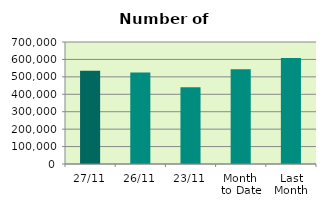
| Category | Series 0 |
|---|---|
| 27/11 | 534826 |
| 26/11 | 524368 |
| 23/11 | 440606 |
| Month 
to Date | 544195.158 |
| Last
Month | 607838.609 |